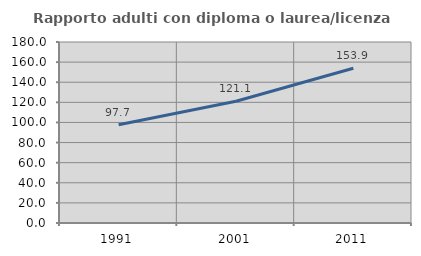
| Category | Rapporto adulti con diploma o laurea/licenza media  |
|---|---|
| 1991.0 | 97.744 |
| 2001.0 | 121.118 |
| 2011.0 | 153.892 |